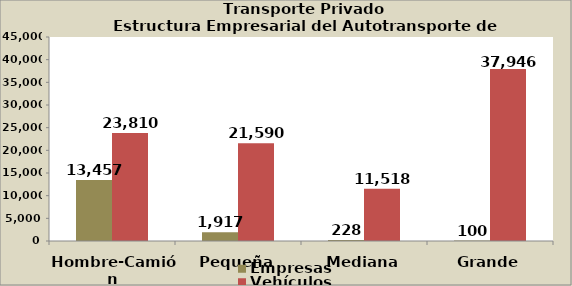
| Category | Empresas | Vehículos |
|---|---|---|
| Hombre-Camión | 13457 | 23810 |
| Pequeña | 1917 | 21590 |
| Mediana | 228 | 11518 |
| Grande | 100 | 37946 |